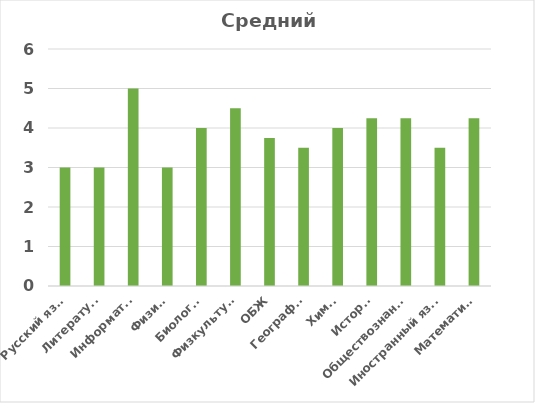
| Category | Средний балл |
|---|---|
| Русский язык  | 3 |
| Литература | 3 |
| Информатка | 5 |
| Физика | 3 |
| Биология | 4 |
| Физкультура | 4.5 |
| ОБЖ | 3.75 |
| География | 3.5 |
| Химия | 4 |
| История | 4.25 |
| Обществознание | 4.25 |
| Иностранный язык | 3.5 |
| Математика | 4.25 |